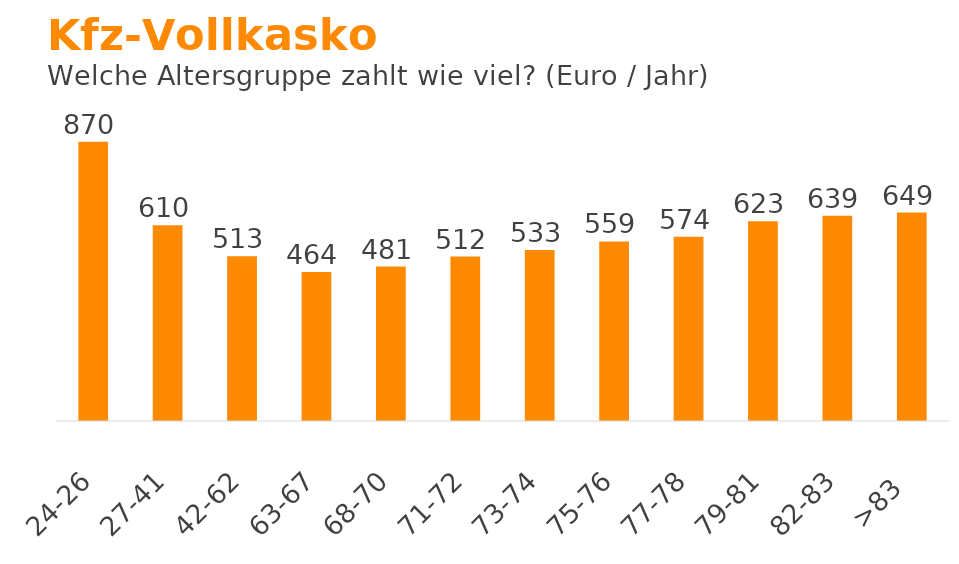
| Category | Euro |
|---|---|
| 24-26 | 870.225 |
| 27-41 | 609.814 |
| 42-62 | 513.276 |
| 63-67 | 463.884 |
| 68-70 | 481.003 |
| 71-72 | 512.179 |
| 73-74 | 533.059 |
| 75-76 | 559.223 |
| 77-78 | 573.912 |
| 79-81 | 622.611 |
| 82-83 | 639.363 |
| >83 | 649.402 |